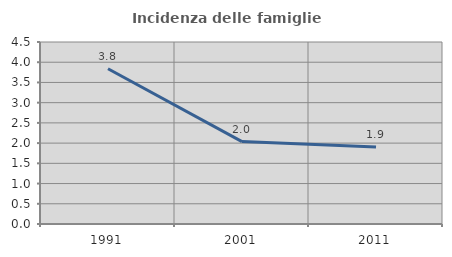
| Category | Incidenza delle famiglie numerose |
|---|---|
| 1991.0 | 3.838 |
| 2001.0 | 2.038 |
| 2011.0 | 1.902 |